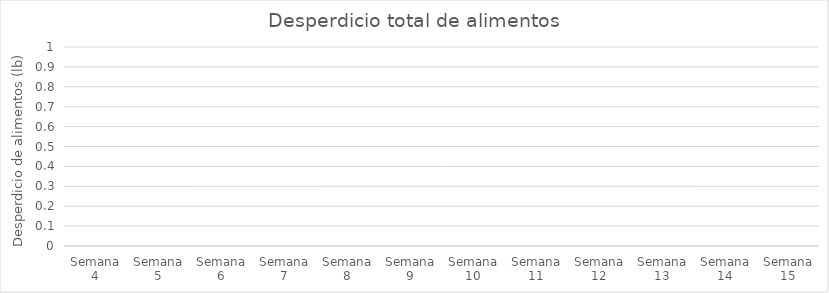
| Category | Series 0 |
|---|---|
| Semana 4 | 0 |
| Semana 5 | 0 |
| Semana 6 | 0 |
| Semana 7 | 0 |
| Semana 8 | 0 |
| Semana 9 | 0 |
| Semana 10 | 0 |
| Semana 11 | 0 |
| Semana 12 | 0 |
| Semana 13 | 0 |
| Semana 14 | 0 |
| Semana 15 | 0 |